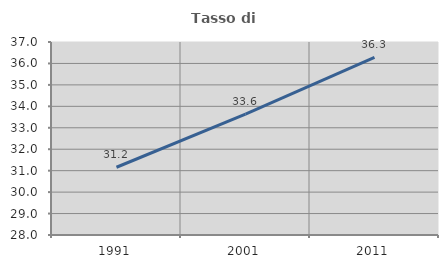
| Category | Tasso di occupazione   |
|---|---|
| 1991.0 | 31.159 |
| 2001.0 | 33.638 |
| 2011.0 | 36.289 |